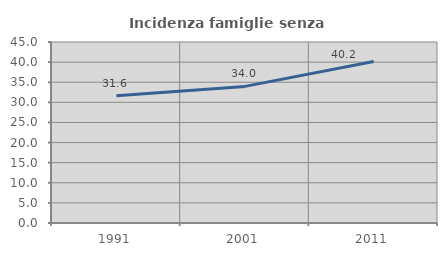
| Category | Incidenza famiglie senza nuclei |
|---|---|
| 1991.0 | 31.61 |
| 2001.0 | 33.964 |
| 2011.0 | 40.151 |